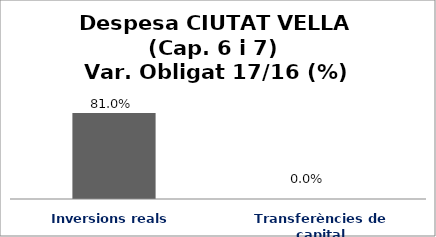
| Category | Series 0 |
|---|---|
| Inversions reals | 0.81 |
| Transferències de capital | 0 |